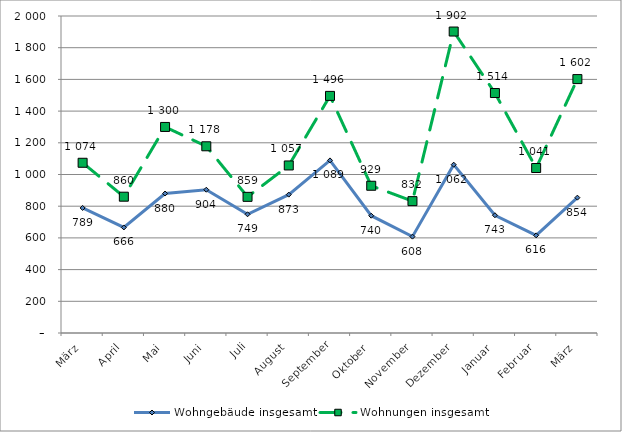
| Category | Wohngebäude insgesamt | Wohnungen insgesamt |
|---|---|---|
| März | 789 | 1074 |
| April | 666 | 860 |
| Mai | 880 | 1300 |
| Juni | 904 | 1178 |
| Juli | 749 | 859 |
| August | 873 | 1057 |
| September | 1089 | 1496 |
| Oktober | 740 | 929 |
| November | 608 | 832 |
| Dezember | 1062 | 1902 |
| Januar | 743 | 1514 |
| Februar | 616 | 1041 |
| März | 854 | 1602 |